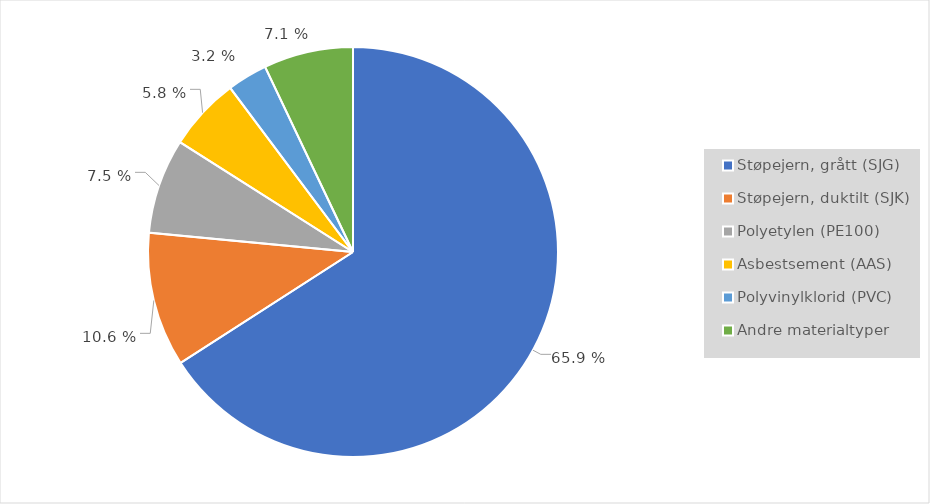
| Category | Series 0 |
|---|---|
| Støpejern, grått (SJG) | 0.659 |
| Støpejern, duktilt (SJK) | 0.106 |
| Polyetylen (PE100) | 0.075 |
| Asbestsement (AAS) | 0.058 |
| Polyvinylklorid (PVC) | 0.032 |
| Andre materialtyper | 0.071 |